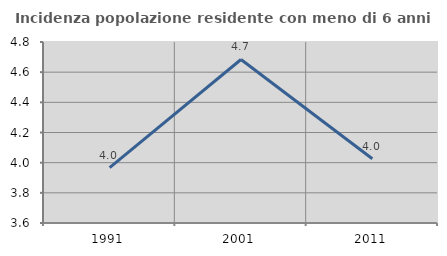
| Category | Incidenza popolazione residente con meno di 6 anni |
|---|---|
| 1991.0 | 3.967 |
| 2001.0 | 4.684 |
| 2011.0 | 4.026 |